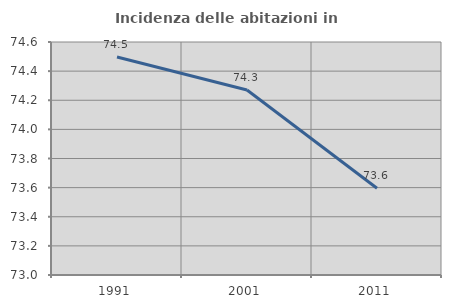
| Category | Incidenza delle abitazioni in proprietà  |
|---|---|
| 1991.0 | 74.497 |
| 2001.0 | 74.27 |
| 2011.0 | 73.595 |